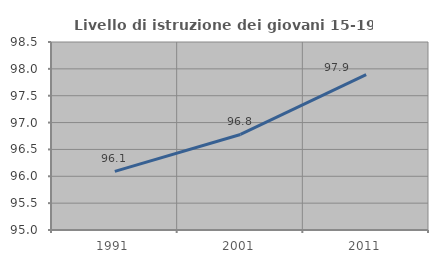
| Category | Livello di istruzione dei giovani 15-19 anni |
|---|---|
| 1991.0 | 96.091 |
| 2001.0 | 96.779 |
| 2011.0 | 97.894 |